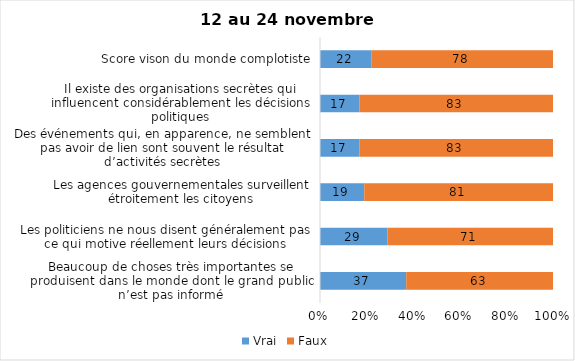
| Category | Vrai | Faux |
|---|---|---|
| Beaucoup de choses très importantes se produisent dans le monde dont le grand public n’est pas informé | 37 | 63 |
| Les politiciens ne nous disent généralement pas ce qui motive réellement leurs décisions | 29 | 71 |
| Les agences gouvernementales surveillent étroitement les citoyens | 19 | 81 |
| Des événements qui, en apparence, ne semblent pas avoir de lien sont souvent le résultat d’activités secrètes | 17 | 83 |
| Il existe des organisations secrètes qui influencent considérablement les décisions politiques | 17 | 83 |
| Score vison du monde complotiste | 22 | 78 |